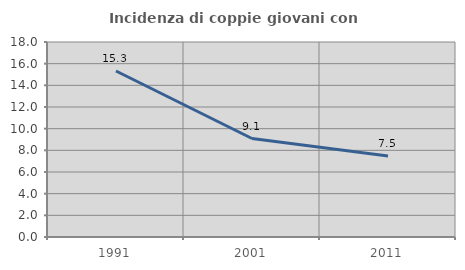
| Category | Incidenza di coppie giovani con figli |
|---|---|
| 1991.0 | 15.323 |
| 2001.0 | 9.091 |
| 2011.0 | 7.473 |